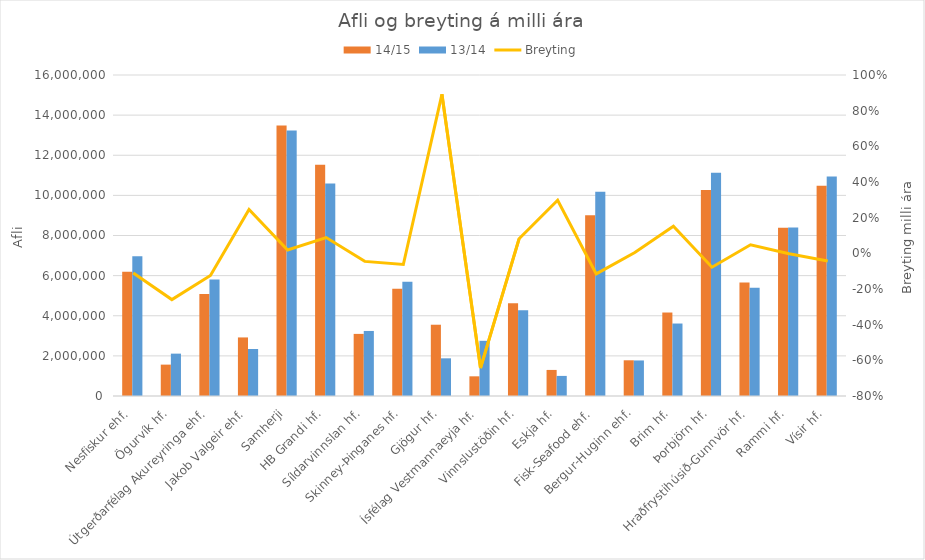
| Category | 14/15 | 13/14 |
|---|---|---|
| Nesfiskur ehf. | 6197005 | 6962985 |
| Ögurvík hf. | 1563841 | 2111470 |
| Útgerðarfélag Akureyringa ehf. | 5084800 | 5802956 |
| Jakob Valgeir ehf. | 2918934 | 2343069 |
| Samherji | 13484837 | 13235025 |
| HB Grandi hf. | 11532232 | 10595487 |
| Síldarvinnslan hf. | 3095697 | 3241819 |
| Skinney-Þinganes hf. | 5340425 | 5697669 |
| Gjögur hf. | 3552808 | 1878153 |
| Ísfélag Vestmannaeyja hf. | 980923 | 2751169 |
| Vinnslustöðin hf. | 4628335 | 4279789 |
| Eskja hf. | 1299170 | 1001192 |
| Fisk-Seafood ehf. | 9007064 | 10183061 |
| Bergur-Huginn ehf. | 1780224 | 1771898 |
| Brim hf. | 4161182 | 3612595 |
| Þorbjörn hf. | 10263954 | 11130888 |
| Hraðfrystihúsið-Gunnvör hf. | 5656613 | 5396743 |
| Rammi hf. | 8381737 | 8404867 |
| Vísir hf. | 10476870 | 10941680 |